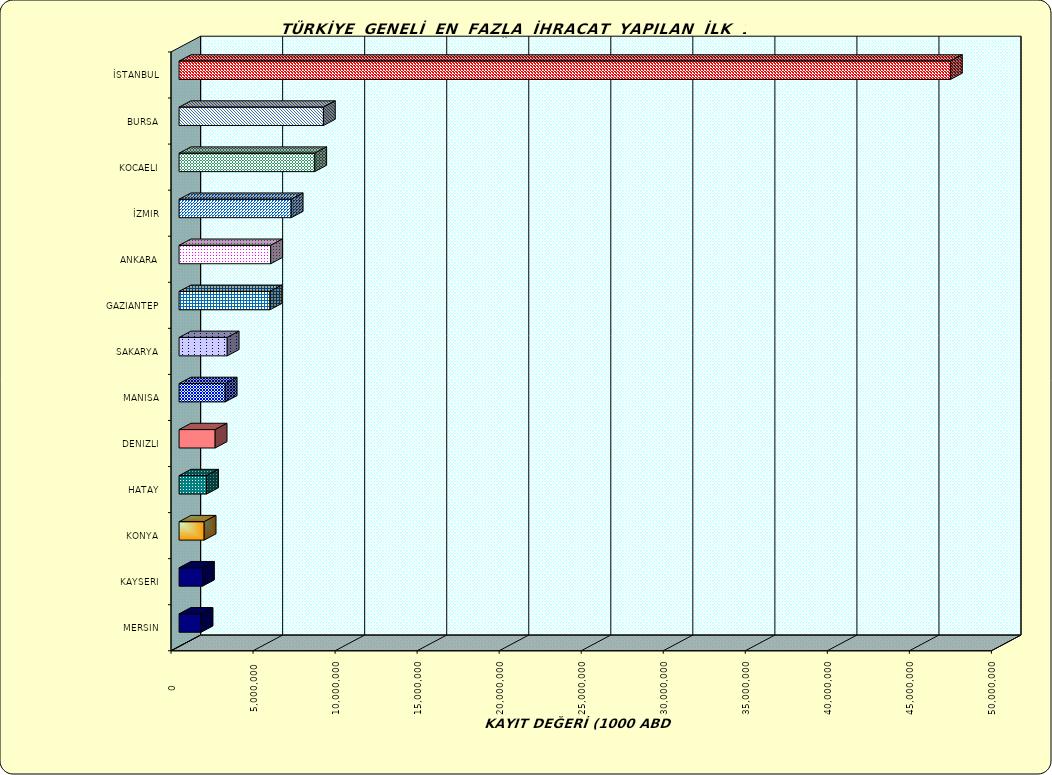
| Category | Series 0 |
|---|---|
| İSTANBUL | 47014258.7 |
| BURSA | 8797708.222 |
| KOCAELI | 8271372.805 |
| İZMIR | 6834905.191 |
| ANKARA | 5584525.856 |
| GAZIANTEP | 5539928.125 |
| SAKARYA | 2934710.109 |
| MANISA | 2813362.694 |
| DENIZLI | 2199438.621 |
| HATAY | 1676298.038 |
| KONYA | 1529519.58 |
| KAYSERI | 1428648.904 |
| MERSIN | 1343263.703 |